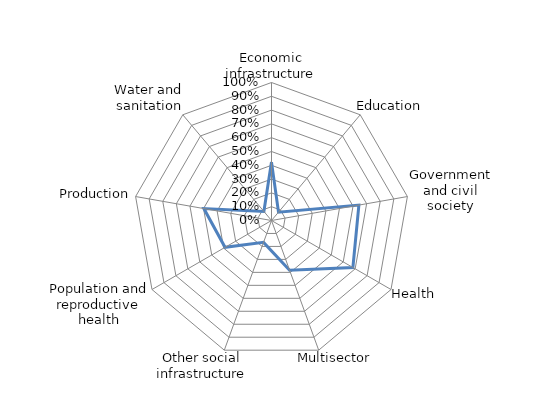
| Category | Series 0 |
|---|---|
| Economic infrastructure | 0.423 |
| Education | 0.079 |
| Government and civil society | 0.643 |
| Health | 0.681 |
| Multisector | 0.384 |
| Other social infrastructure | 0.169 |
| Population and reproductive health | 0.389 |
| Production | 0.498 |
| Water and sanitation | 0.086 |